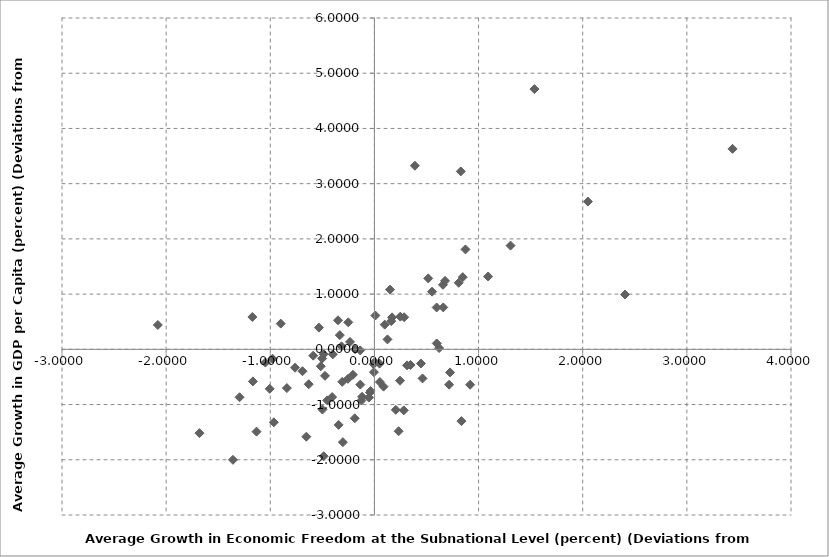
| Category | Series 0 |
|---|---|
| 0.16154539274900453 | 0.511 |
| -0.036545328406775754 | -0.755 |
| 0.04890361144426912 | -0.259 |
| -0.630693576165735 | -0.632 |
| 0.82941919591597 | 3.222 |
| -1.6800467562151367 | -1.518 |
| -1.3585613753172976 | -2.001 |
| -1.005177650576278 | -0.715 |
| 0.23232151322213307 | -1.483 |
| 3.438834973349846 | 3.631 |
| 0.3135190777881714 | -0.29 |
| 2.0494082135909606 | 2.676 |
| -0.49913146775865297 | -1.09 |
| -0.5328839342063038 | 0.393 |
| -0.004800029806717454 | -0.413 |
| -0.8405139646373624 | -0.702 |
| -0.6906439988299734 | -0.397 |
| -0.9661634014348792 | -1.321 |
| -0.6539742654169827 | -1.582 |
| -0.30308679189148746 | -1.681 |
| -0.1845651972493782 | 0.002 |
| 0.2054215046787624 | -1.096 |
| -0.7622518219457872 | -0.333 |
| -0.20631401636997557 | -0.461 |
| -0.3499647047928535 | 0.526 |
| 0.12512578701344043 | 0.18 |
| -0.5153954196076381 | -0.306 |
| 1.3071709500450868 | 1.879 |
| -0.11889042259912676 | -0.859 |
| -0.3321578331329251 | 0.257 |
| -0.3998285064047942 | -0.091 |
| -0.48684229044879584 | -1.936 |
| -0.47471039023233264 | -0.48 |
| -0.5020192174810666 | -0.167 |
| -0.052980916971425915 | -0.873 |
| 0.8096701532934087 | 1.205 |
| 0.5975454223085143 | 0.758 |
| -1.1319351487919702 | -1.491 |
| -0.2544406829934532 | -0.535 |
| -1.167108777583405 | -0.58 |
| 0.08771950308993674 | -0.675 |
| -0.25091243258472967 | 0.489 |
| -0.04238205672155936 | -0.782 |
| 1.5363015413424892 | 4.712 |
| 0.4619835637577705 | -0.527 |
| 0.516773770055115 | 1.285 |
| 1.0918602451814485 | 1.319 |
| -0.48687647719939875 | -0.086 |
| 0.346113368487741 | -0.283 |
| -0.34358851417537056 | -1.369 |
| 0.24884580487338878 | 0.592 |
| -0.45325668817939574 | -0.924 |
| 0.6580712403429367 | 1.168 |
| 0.16952161585057146 | 0.579 |
| -0.9783532276501127 | -0.171 |
| -0.007882257691334271 | -0.269 |
| 0.6215300806426348 | 0.022 |
| 2.4060562386140627 | 0.992 |
| 0.05267152115085538 | -0.592 |
| 0.3885452526818899 | 3.325 |
| 0.008960059750743807 | 0.612 |
| 0.2817164110416128 | -1.106 |
| 0.0033472677020500094 | -0.229 |
| -0.1365579481863926 | -0.019 |
| -2.079870510562863 | 0.441 |
| 0.918804809252647 | -0.641 |
| 0.8355731718815451 | -1.3 |
| -1.1718524545924127 | 0.586 |
| 0.6782140534331145 | 1.24 |
| -0.40649832225698523 | -0.865 |
| 0.44701235365784364 | -0.256 |
| 0.2458460322389857 | -0.568 |
| -0.12441423383017375 | -0.927 |
| 0.5984178444453494 | 0.107 |
| -0.8995185068673692 | 0.466 |
| -0.13527775801293415 | -0.639 |
| 0.7263234010114763 | -0.418 |
| -1.0469083344672012 | -0.24 |
| 0.8482725967311543 | 1.307 |
| -1.2954020615808604 | -0.868 |
| 0.2854727401522141 | 0.582 |
| 0.14987268646708182 | 1.081 |
| -0.5873024722967928 | -0.115 |
| 0.5533039842135595 | 1.044 |
| -0.31599799602025963 | 0.054 |
| 0.6610038413662214 | 0.759 |
| -0.3091122021920481 | -0.589 |
| 0.7171229578771355 | -0.64 |
| -0.18911133157192786 | -1.249 |
| -0.2343227407706547 | 0.134 |
| 0.09893322826477237 | 0.447 |
| 0.8739494337213655 | 1.809 |